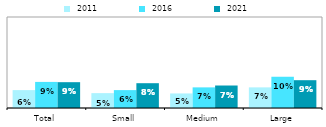
| Category |  2011 |  2016 |  2021 |
|---|---|---|---|
| Total | 0.059 | 0.086 | 0.085 |
| Small | 0.049 | 0.059 | 0.082 |
| Medium | 0.048 | 0.068 | 0.074 |
| Large | 0.068 | 0.103 | 0.092 |